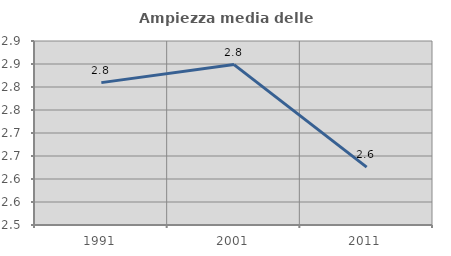
| Category | Ampiezza media delle famiglie |
|---|---|
| 1991.0 | 2.81 |
| 2001.0 | 2.849 |
| 2011.0 | 2.626 |